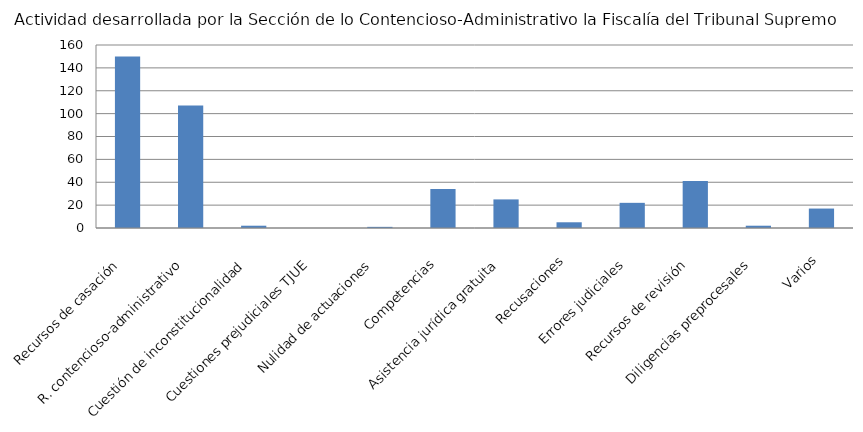
| Category | Series 0 |
|---|---|
| Recursos de casación  | 150 |
| R. contencioso-administrativo  | 107 |
| Cuestión de inconstitucionalidad  | 2 |
| Cuestiones prejudiciales TJUE  | 0 |
| Nulidad de actuaciones  | 1 |
| Competencias  | 34 |
| Asistencia jurídica gratuita  | 25 |
| Recusaciones  | 5 |
| Errores judiciales  | 22 |
| Recursos de revisión  | 41 |
| Diligencias preprocesales  | 2 |
| Varios | 17 |